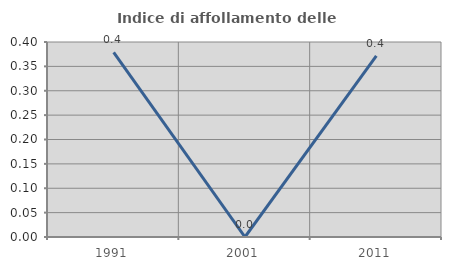
| Category | Indice di affollamento delle abitazioni  |
|---|---|
| 1991.0 | 0.379 |
| 2001.0 | 0 |
| 2011.0 | 0.372 |